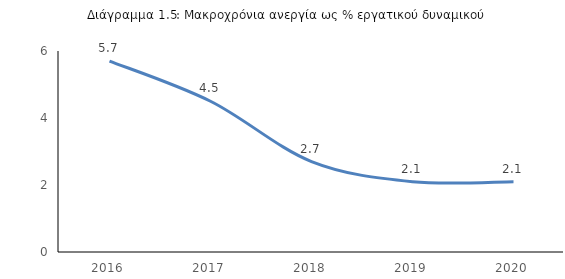
| Category |  >12 μήνες/εργατικό δυναμικό % |
|---|---|
| 2016.0 | 5.7 |
| 2017.0 | 4.5 |
| 2018.0 | 2.7 |
| 2019.0 | 2.1 |
| 2020.0 | 2.1 |